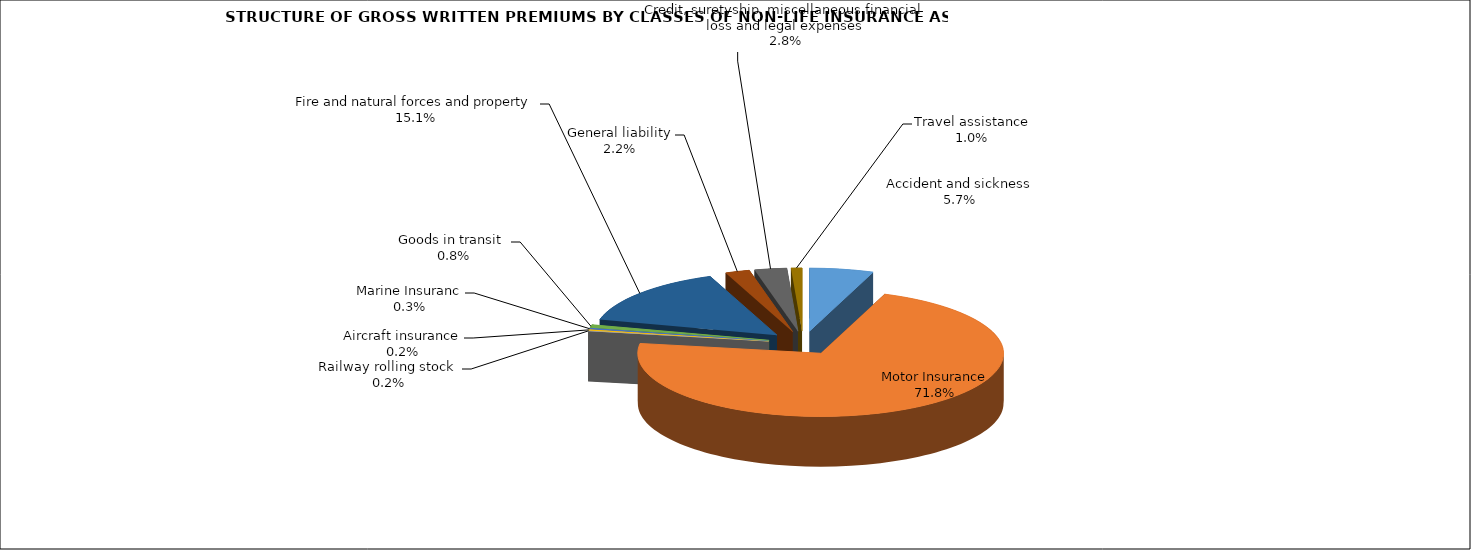
| Category | Accident and sickness |
|---|---|
| Accident and sickness | 0.057 |
| Motor Insurance | 0.718 |
| Railway rolling stock  | 0.002 |
| Aircraft insurance | 0.002 |
| Marine Insuranc | 0.003 |
| Goods in transit  | 0.008 |
| Fire and natural forces and property | 0.151 |
| General liability | 0.022 |
| Credit, suretyship, miscellaneous financial loss and legal expenses | 0.028 |
| Travel assistance | 0.01 |